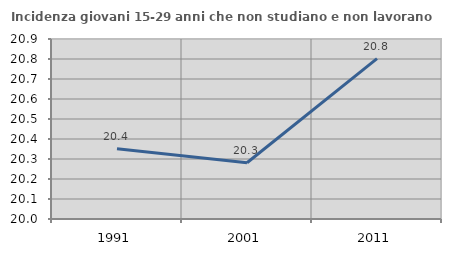
| Category | Incidenza giovani 15-29 anni che non studiano e non lavorano  |
|---|---|
| 1991.0 | 20.351 |
| 2001.0 | 20.281 |
| 2011.0 | 20.802 |